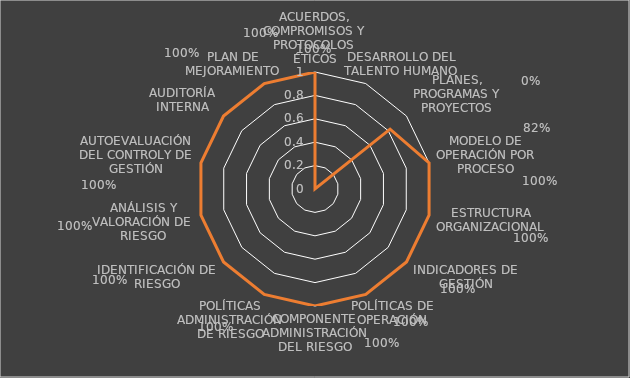
| Category | Series 0 | Series 1 |
|---|---|---|
| ACUERDOS, COMPROMISOS Y PROTOCOLOS ÉTICOS |  | 1 |
| DESARROLLO DEL TALENTO HUMANO |  | 0 |
| PLANES, PROGRAMAS Y PROYECTOS |  | 0.821 |
| MODELO DE OPERACIÓN POR PROCESO |  | 1 |
| ESTRUCTURA ORGANIZACIONAL |  | 1 |
| INDICADORES DE GESTIÓN |  | 1 |
| POLÍTICAS DE OPERACIÓN |  | 1 |
| COMPONENTE ADMINISTRACIÓN DEL RIESGO |  | 1 |
| POLÍTICAS ADMINISTRACIÓN DE RIESGO |  | 1 |
| IDENTIFICACIÓN DE RIESGO |  | 1 |
| ANÁLISIS Y VALORACIÓN DE RIESGO |  | 1 |
| AUTOEVALUACIÓN DEL CONTROLY DE GESTIÓN |  | 1 |
| AUDITORÍA INTERNA |  | 1 |
| PLAN DE MEJORAMIENTO |  | 1 |